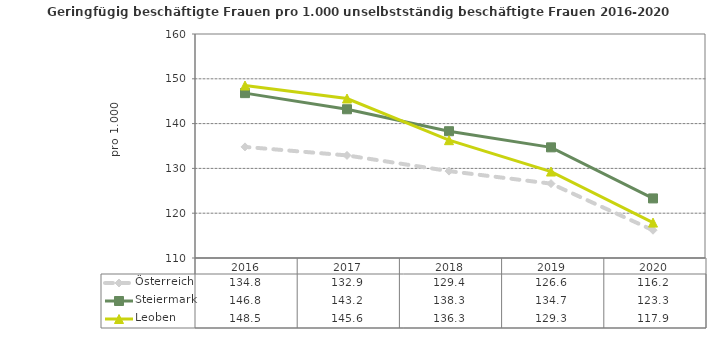
| Category | Österreich | Steiermark | Leoben |
|---|---|---|---|
| 2020.0 | 116.2 | 123.3 | 117.9 |
| 2019.0 | 126.6 | 134.7 | 129.3 |
| 2018.0 | 129.4 | 138.3 | 136.3 |
| 2017.0 | 132.9 | 143.2 | 145.6 |
| 2016.0 | 134.8 | 146.8 | 148.5 |